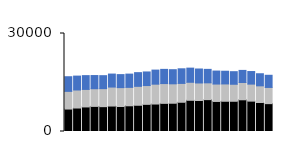
| Category | North Online | North Store | North Phone |
|---|---|---|---|
| 0 | 6873 | 5411 | 4484 |
| 1 | 7188 | 5521 | 4250 |
| 2 | 7518 | 5364 | 4223 |
| 3 | 7685 | 5409 | 4038 |
| 4 | 7603 | 5518 | 3970 |
| 5 | 7792 | 5812 | 3977 |
| 6 | 7645 | 5789 | 3983 |
| 7 | 7874 | 5634 | 4060 |
| 8 | 8032 | 5790 | 4195 |
| 9 | 8313 | 5754 | 4162 |
| 10 | 8408 | 6079 | 4310 |
| 11 | 8617 | 6052 | 4350 |
| 12 | 8653 | 5942 | 4325 |
| 13 | 8950 | 5769 | 4475 |
| 14 | 9553 | 5511 | 4334 |
| 15 | 9495 | 5359 | 4277 |
| 16 | 9757 | 5142 | 4122 |
| 17 | 9195 | 5330 | 3977 |
| 18 | 9258 | 5302 | 3889 |
| 19 | 9252 | 5208 | 3854 |
| 20 | 9708 | 5286 | 3709 |
| 21 | 9296 | 5211 | 3850 |
| 22 | 8881 | 5097 | 3705 |
| 23 | 8530 | 4959 | 3720 |